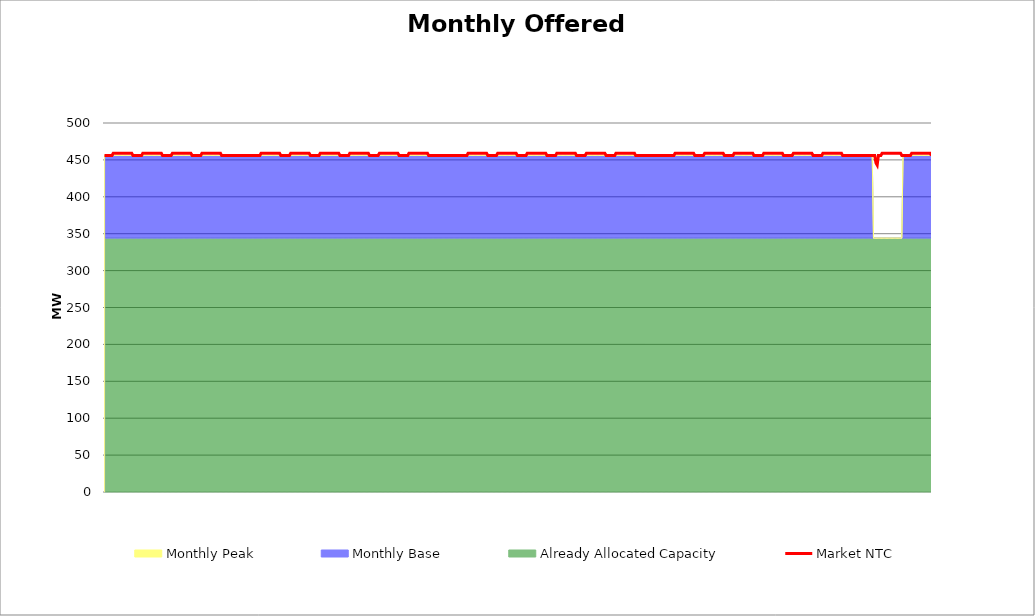
| Category | Market NTC |
|---|---|
| 0 | 456 |
| 1 | 456 |
| 2 | 456 |
| 3 | 456 |
| 4 | 456 |
| 5 | 456 |
| 6 | 456 |
| 7 | 459 |
| 8 | 459 |
| 9 | 459 |
| 10 | 459 |
| 11 | 459 |
| 12 | 459 |
| 13 | 459 |
| 14 | 459 |
| 15 | 459 |
| 16 | 459 |
| 17 | 459 |
| 18 | 459 |
| 19 | 459 |
| 20 | 459 |
| 21 | 459 |
| 22 | 459 |
| 23 | 456 |
| 24 | 456 |
| 25 | 456 |
| 26 | 456 |
| 27 | 456 |
| 28 | 456 |
| 29 | 456 |
| 30 | 456 |
| 31 | 459 |
| 32 | 459 |
| 33 | 459 |
| 34 | 459 |
| 35 | 459 |
| 36 | 459 |
| 37 | 459 |
| 38 | 459 |
| 39 | 459 |
| 40 | 459 |
| 41 | 459 |
| 42 | 459 |
| 43 | 459 |
| 44 | 459 |
| 45 | 459 |
| 46 | 459 |
| 47 | 456 |
| 48 | 456 |
| 49 | 456 |
| 50 | 456 |
| 51 | 456 |
| 52 | 456 |
| 53 | 456 |
| 54 | 456 |
| 55 | 459 |
| 56 | 459 |
| 57 | 459 |
| 58 | 459 |
| 59 | 459 |
| 60 | 459 |
| 61 | 459 |
| 62 | 459 |
| 63 | 459 |
| 64 | 459 |
| 65 | 459 |
| 66 | 459 |
| 67 | 459 |
| 68 | 459 |
| 69 | 459 |
| 70 | 459 |
| 71 | 456 |
| 72 | 456 |
| 73 | 456 |
| 74 | 456 |
| 75 | 456 |
| 76 | 456 |
| 77 | 456 |
| 78 | 456 |
| 79 | 459 |
| 80 | 459 |
| 81 | 459 |
| 82 | 459 |
| 83 | 459 |
| 84 | 459 |
| 85 | 459 |
| 86 | 459 |
| 87 | 459 |
| 88 | 459 |
| 89 | 459 |
| 90 | 459 |
| 91 | 459 |
| 92 | 459 |
| 93 | 459 |
| 94 | 459 |
| 95 | 456 |
| 96 | 456 |
| 97 | 456 |
| 98 | 456 |
| 99 | 456 |
| 100 | 456 |
| 101 | 456 |
| 102 | 456 |
| 103 | 456 |
| 104 | 456 |
| 105 | 456 |
| 106 | 456 |
| 107 | 456 |
| 108 | 456 |
| 109 | 456 |
| 110 | 456 |
| 111 | 456 |
| 112 | 456 |
| 113 | 456 |
| 114 | 456 |
| 115 | 456 |
| 116 | 456 |
| 117 | 456 |
| 118 | 456 |
| 119 | 456 |
| 120 | 456 |
| 121 | 456 |
| 122 | 456 |
| 123 | 456 |
| 124 | 456 |
| 125 | 456 |
| 126 | 456 |
| 127 | 459 |
| 128 | 459 |
| 129 | 459 |
| 130 | 459 |
| 131 | 459 |
| 132 | 459 |
| 133 | 459 |
| 134 | 459 |
| 135 | 459 |
| 136 | 459 |
| 137 | 459 |
| 138 | 459 |
| 139 | 459 |
| 140 | 459 |
| 141 | 459 |
| 142 | 459 |
| 143 | 456 |
| 144 | 456 |
| 145 | 456 |
| 146 | 456 |
| 147 | 456 |
| 148 | 456 |
| 149 | 456 |
| 150 | 456 |
| 151 | 459 |
| 152 | 459 |
| 153 | 459 |
| 154 | 459 |
| 155 | 459 |
| 156 | 459 |
| 157 | 459 |
| 158 | 459 |
| 159 | 459 |
| 160 | 459 |
| 161 | 459 |
| 162 | 459 |
| 163 | 459 |
| 164 | 459 |
| 165 | 459 |
| 166 | 459 |
| 167 | 456 |
| 168 | 456 |
| 169 | 456 |
| 170 | 456 |
| 171 | 456 |
| 172 | 456 |
| 173 | 456 |
| 174 | 456 |
| 175 | 459 |
| 176 | 459 |
| 177 | 459 |
| 178 | 459 |
| 179 | 459 |
| 180 | 459 |
| 181 | 459 |
| 182 | 459 |
| 183 | 459 |
| 184 | 459 |
| 185 | 459 |
| 186 | 459 |
| 187 | 459 |
| 188 | 459 |
| 189 | 459 |
| 190 | 459 |
| 191 | 456 |
| 192 | 456 |
| 193 | 456 |
| 194 | 456 |
| 195 | 456 |
| 196 | 456 |
| 197 | 456 |
| 198 | 456 |
| 199 | 459 |
| 200 | 459 |
| 201 | 459 |
| 202 | 459 |
| 203 | 459 |
| 204 | 459 |
| 205 | 459 |
| 206 | 459 |
| 207 | 459 |
| 208 | 459 |
| 209 | 459 |
| 210 | 459 |
| 211 | 459 |
| 212 | 459 |
| 213 | 459 |
| 214 | 459 |
| 215 | 456 |
| 216 | 456 |
| 217 | 456 |
| 218 | 456 |
| 219 | 456 |
| 220 | 456 |
| 221 | 456 |
| 222 | 456 |
| 223 | 459 |
| 224 | 459 |
| 225 | 459 |
| 226 | 459 |
| 227 | 459 |
| 228 | 459 |
| 229 | 459 |
| 230 | 459 |
| 231 | 459 |
| 232 | 459 |
| 233 | 459 |
| 234 | 459 |
| 235 | 459 |
| 236 | 459 |
| 237 | 459 |
| 238 | 459 |
| 239 | 456 |
| 240 | 456 |
| 241 | 456 |
| 242 | 456 |
| 243 | 456 |
| 244 | 456 |
| 245 | 456 |
| 246 | 456 |
| 247 | 459 |
| 248 | 459 |
| 249 | 459 |
| 250 | 459 |
| 251 | 459 |
| 252 | 459 |
| 253 | 459 |
| 254 | 459 |
| 255 | 459 |
| 256 | 459 |
| 257 | 459 |
| 258 | 459 |
| 259 | 459 |
| 260 | 459 |
| 261 | 459 |
| 262 | 459 |
| 263 | 456 |
| 264 | 456 |
| 265 | 456 |
| 266 | 456 |
| 267 | 456 |
| 268 | 456 |
| 269 | 456 |
| 270 | 456 |
| 271 | 456 |
| 272 | 456 |
| 273 | 456 |
| 274 | 456 |
| 275 | 456 |
| 276 | 456 |
| 277 | 456 |
| 278 | 456 |
| 279 | 456 |
| 280 | 456 |
| 281 | 456 |
| 282 | 456 |
| 283 | 456 |
| 284 | 456 |
| 285 | 456 |
| 286 | 456 |
| 287 | 456 |
| 288 | 456 |
| 289 | 456 |
| 290 | 456 |
| 291 | 456 |
| 292 | 456 |
| 293 | 456 |
| 294 | 456 |
| 295 | 459 |
| 296 | 459 |
| 297 | 459 |
| 298 | 459 |
| 299 | 459 |
| 300 | 459 |
| 301 | 459 |
| 302 | 459 |
| 303 | 459 |
| 304 | 459 |
| 305 | 459 |
| 306 | 459 |
| 307 | 459 |
| 308 | 459 |
| 309 | 459 |
| 310 | 459 |
| 311 | 456 |
| 312 | 456 |
| 313 | 456 |
| 314 | 456 |
| 315 | 456 |
| 316 | 456 |
| 317 | 456 |
| 318 | 456 |
| 319 | 459 |
| 320 | 459 |
| 321 | 459 |
| 322 | 459 |
| 323 | 459 |
| 324 | 459 |
| 325 | 459 |
| 326 | 459 |
| 327 | 459 |
| 328 | 459 |
| 329 | 459 |
| 330 | 459 |
| 331 | 459 |
| 332 | 459 |
| 333 | 459 |
| 334 | 459 |
| 335 | 456 |
| 336 | 456 |
| 337 | 456 |
| 338 | 456 |
| 339 | 456 |
| 340 | 456 |
| 341 | 456 |
| 342 | 456 |
| 343 | 459 |
| 344 | 459 |
| 345 | 459 |
| 346 | 459 |
| 347 | 459 |
| 348 | 459 |
| 349 | 459 |
| 350 | 459 |
| 351 | 459 |
| 352 | 459 |
| 353 | 459 |
| 354 | 459 |
| 355 | 459 |
| 356 | 459 |
| 357 | 459 |
| 358 | 459 |
| 359 | 456 |
| 360 | 456 |
| 361 | 456 |
| 362 | 456 |
| 363 | 456 |
| 364 | 456 |
| 365 | 456 |
| 366 | 456 |
| 367 | 459 |
| 368 | 459 |
| 369 | 459 |
| 370 | 459 |
| 371 | 459 |
| 372 | 459 |
| 373 | 459 |
| 374 | 459 |
| 375 | 459 |
| 376 | 459 |
| 377 | 459 |
| 378 | 459 |
| 379 | 459 |
| 380 | 459 |
| 381 | 459 |
| 382 | 459 |
| 383 | 456 |
| 384 | 456 |
| 385 | 456 |
| 386 | 456 |
| 387 | 456 |
| 388 | 456 |
| 389 | 456 |
| 390 | 456 |
| 391 | 459 |
| 392 | 459 |
| 393 | 459 |
| 394 | 459 |
| 395 | 459 |
| 396 | 459 |
| 397 | 459 |
| 398 | 459 |
| 399 | 459 |
| 400 | 459 |
| 401 | 459 |
| 402 | 459 |
| 403 | 459 |
| 404 | 459 |
| 405 | 459 |
| 406 | 459 |
| 407 | 456 |
| 408 | 456 |
| 409 | 456 |
| 410 | 456 |
| 411 | 456 |
| 412 | 456 |
| 413 | 456 |
| 414 | 456 |
| 415 | 459 |
| 416 | 459 |
| 417 | 459 |
| 418 | 459 |
| 419 | 459 |
| 420 | 459 |
| 421 | 459 |
| 422 | 459 |
| 423 | 459 |
| 424 | 459 |
| 425 | 459 |
| 426 | 459 |
| 427 | 459 |
| 428 | 459 |
| 429 | 459 |
| 430 | 459 |
| 431 | 456 |
| 432 | 456 |
| 433 | 456 |
| 434 | 456 |
| 435 | 456 |
| 436 | 456 |
| 437 | 456 |
| 438 | 456 |
| 439 | 456 |
| 440 | 456 |
| 441 | 456 |
| 442 | 456 |
| 443 | 456 |
| 444 | 456 |
| 445 | 456 |
| 446 | 456 |
| 447 | 456 |
| 448 | 456 |
| 449 | 456 |
| 450 | 456 |
| 451 | 456 |
| 452 | 456 |
| 453 | 456 |
| 454 | 456 |
| 455 | 456 |
| 456 | 456 |
| 457 | 456 |
| 458 | 456 |
| 459 | 456 |
| 460 | 456 |
| 461 | 456 |
| 462 | 456 |
| 463 | 459 |
| 464 | 459 |
| 465 | 459 |
| 466 | 459 |
| 467 | 459 |
| 468 | 459 |
| 469 | 459 |
| 470 | 459 |
| 471 | 459 |
| 472 | 459 |
| 473 | 459 |
| 474 | 459 |
| 475 | 459 |
| 476 | 459 |
| 477 | 459 |
| 478 | 459 |
| 479 | 456 |
| 480 | 456 |
| 481 | 456 |
| 482 | 456 |
| 483 | 456 |
| 484 | 456 |
| 485 | 456 |
| 486 | 456 |
| 487 | 459 |
| 488 | 459 |
| 489 | 459 |
| 490 | 459 |
| 491 | 459 |
| 492 | 459 |
| 493 | 459 |
| 494 | 459 |
| 495 | 459 |
| 496 | 459 |
| 497 | 459 |
| 498 | 459 |
| 499 | 459 |
| 500 | 459 |
| 501 | 459 |
| 502 | 459 |
| 503 | 456 |
| 504 | 456 |
| 505 | 456 |
| 506 | 456 |
| 507 | 456 |
| 508 | 456 |
| 509 | 456 |
| 510 | 456 |
| 511 | 459 |
| 512 | 459 |
| 513 | 459 |
| 514 | 459 |
| 515 | 459 |
| 516 | 459 |
| 517 | 459 |
| 518 | 459 |
| 519 | 459 |
| 520 | 459 |
| 521 | 459 |
| 522 | 459 |
| 523 | 459 |
| 524 | 459 |
| 525 | 459 |
| 526 | 459 |
| 527 | 456 |
| 528 | 456 |
| 529 | 456 |
| 530 | 456 |
| 531 | 456 |
| 532 | 456 |
| 533 | 456 |
| 534 | 456 |
| 535 | 459 |
| 536 | 459 |
| 537 | 459 |
| 538 | 459 |
| 539 | 459 |
| 540 | 459 |
| 541 | 459 |
| 542 | 459 |
| 543 | 459 |
| 544 | 459 |
| 545 | 459 |
| 546 | 459 |
| 547 | 459 |
| 548 | 459 |
| 549 | 459 |
| 550 | 459 |
| 551 | 456 |
| 552 | 456 |
| 553 | 456 |
| 554 | 456 |
| 555 | 456 |
| 556 | 456 |
| 557 | 456 |
| 558 | 456 |
| 559 | 459 |
| 560 | 459 |
| 561 | 459 |
| 562 | 459 |
| 563 | 459 |
| 564 | 459 |
| 565 | 459 |
| 566 | 459 |
| 567 | 459 |
| 568 | 459 |
| 569 | 459 |
| 570 | 459 |
| 571 | 459 |
| 572 | 459 |
| 573 | 459 |
| 574 | 459 |
| 575 | 456 |
| 576 | 456 |
| 577 | 456 |
| 578 | 456 |
| 579 | 456 |
| 580 | 456 |
| 581 | 456 |
| 582 | 456 |
| 583 | 459 |
| 584 | 459 |
| 585 | 459 |
| 586 | 459 |
| 587 | 459 |
| 588 | 459 |
| 589 | 459 |
| 590 | 459 |
| 591 | 459 |
| 592 | 459 |
| 593 | 459 |
| 594 | 459 |
| 595 | 459 |
| 596 | 459 |
| 597 | 459 |
| 598 | 459 |
| 599 | 456 |
| 600 | 456 |
| 601 | 456 |
| 602 | 456 |
| 603 | 456 |
| 604 | 456 |
| 605 | 456 |
| 606 | 456 |
| 607 | 456 |
| 608 | 456 |
| 609 | 456 |
| 610 | 456 |
| 611 | 456 |
| 612 | 456 |
| 613 | 456 |
| 614 | 456 |
| 615 | 456 |
| 616 | 456 |
| 617 | 456 |
| 618 | 456 |
| 619 | 456 |
| 620 | 456 |
| 621 | 456 |
| 622 | 456 |
| 623 | 456 |
| 624 | 456 |
| 625 | 456 |
| 626 | 446 |
| 627 | 443 |
| 628 | 456 |
| 629 | 456 |
| 630 | 456 |
| 631 | 459 |
| 632 | 459 |
| 633 | 459 |
| 634 | 459 |
| 635 | 459 |
| 636 | 459 |
| 637 | 459 |
| 638 | 459 |
| 639 | 459 |
| 640 | 459 |
| 641 | 459 |
| 642 | 459 |
| 643 | 459 |
| 644 | 459 |
| 645 | 459 |
| 646 | 459 |
| 647 | 456 |
| 648 | 456 |
| 649 | 456 |
| 650 | 456 |
| 651 | 456 |
| 652 | 456 |
| 653 | 456 |
| 654 | 456 |
| 655 | 459 |
| 656 | 459 |
| 657 | 459 |
| 658 | 459 |
| 659 | 459 |
| 660 | 459 |
| 661 | 459 |
| 662 | 459 |
| 663 | 459 |
| 664 | 459 |
| 665 | 459 |
| 666 | 459 |
| 667 | 459 |
| 668 | 459 |
| 669 | 459 |
| 670 | 459 |
| 671 | 456 |